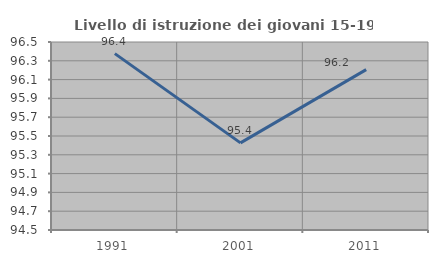
| Category | Livello di istruzione dei giovani 15-19 anni |
|---|---|
| 1991.0 | 96.376 |
| 2001.0 | 95.427 |
| 2011.0 | 96.206 |